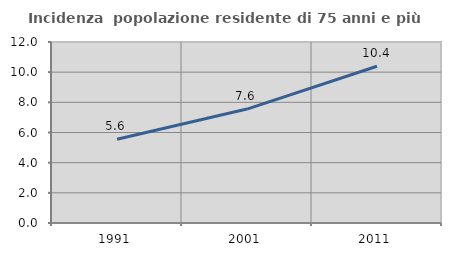
| Category | Incidenza  popolazione residente di 75 anni e più |
|---|---|
| 1991.0 | 5.551 |
| 2001.0 | 7.552 |
| 2011.0 | 10.392 |